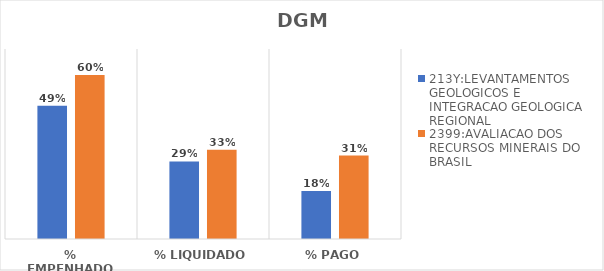
| Category | 213Y:LEVANTAMENTOS GEOLOGICOS E INTEGRACAO GEOLOGICA REGIONAL | 2399:AVALIACAO DOS RECURSOS MINERAIS DO BRASIL |
|---|---|---|
| % EMPENHADO | 0.491 | 0.605 |
| % LIQUIDADO | 0.286 | 0.329 |
| % PAGO | 0.177 | 0.308 |